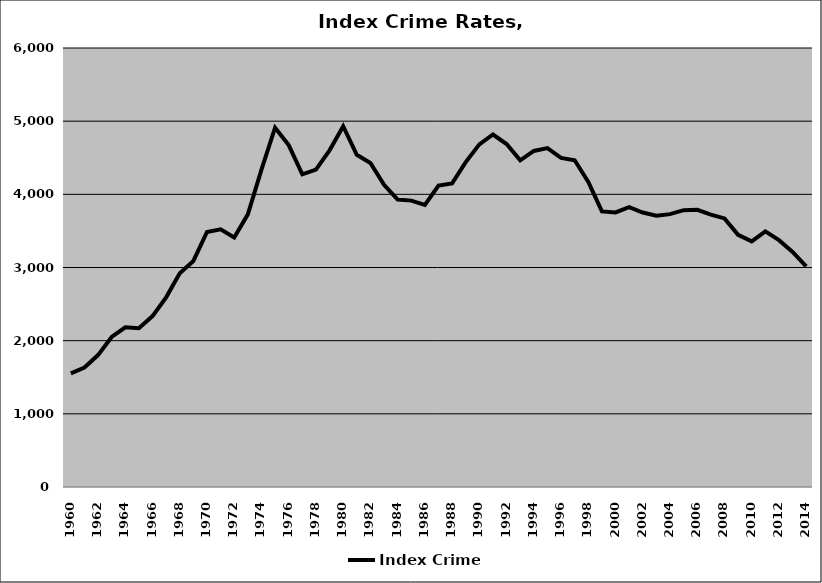
| Category | Index Crime |
|---|---|
| 1960.0 | 1553.695 |
| 1961.0 | 1632.668 |
| 1962.0 | 1802.778 |
| 1963.0 | 2050.192 |
| 1964.0 | 2183.254 |
| 1965.0 | 2170.502 |
| 1966.0 | 2336.072 |
| 1967.0 | 2592.48 |
| 1968.0 | 2920.229 |
| 1969.0 | 3089.371 |
| 1970.0 | 3484.916 |
| 1971.0 | 3522.734 |
| 1972.0 | 3409.715 |
| 1973.0 | 3726.693 |
| 1974.0 | 4336.867 |
| 1975.0 | 4911.448 |
| 1976.0 | 4673.255 |
| 1977.0 | 4272.852 |
| 1978.0 | 4338.537 |
| 1979.0 | 4601.426 |
| 1980.0 | 4930.359 |
| 1981.0 | 4539.773 |
| 1982.0 | 4429.501 |
| 1983.0 | 4129.805 |
| 1984.0 | 3929.411 |
| 1985.0 | 3914.057 |
| 1986.0 | 3854.833 |
| 1987.0 | 4119.761 |
| 1988.0 | 4150.027 |
| 1989.0 | 4439.961 |
| 1990.0 | 4683.325 |
| 1991.0 | 4817.807 |
| 1992.0 | 4686.948 |
| 1993.0 | 4465.08 |
| 1994.0 | 4592.837 |
| 1995.0 | 4631.535 |
| 1996.0 | 4498.237 |
| 1997.0 | 4466.269 |
| 1998.0 | 4169.385 |
| 1999.0 | 3765.972 |
| 2000.0 | 3751.921 |
| 2001.0 | 3823.924 |
| 2002.0 | 3751.328 |
| 2003.0 | 3708.015 |
| 2004.0 | 3729.569 |
| 2005.0 | 3783.583 |
| 2006.0 | 3787.744 |
| 2007.0 | 3723.046 |
| 2008.0 | 3670.439 |
| 2009.0 | 3446.335 |
| 2010.0 | 3356.811 |
| 2011.0 | 3493.288 |
| 2012.0 | 3373.285 |
| 2013.0 | 3212.726 |
| 2014.0 | 3014.694 |